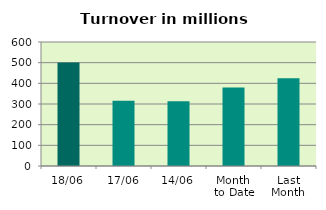
| Category | Series 0 |
|---|---|
| 18/06 | 501.074 |
| 17/06 | 316.199 |
| 14/06 | 313.335 |
| Month 
to Date | 380.172 |
| Last
Month | 424.091 |